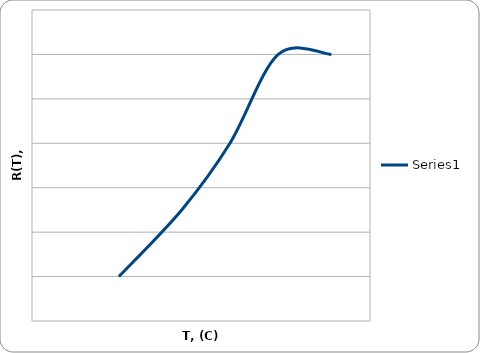
| Category | Series 0 |
|---|---|
| 18.0 | 46.5 |
| 31.0 | 46.53 |
| 41.0 | 46.56 |
| 51.0 | 46.6 |
| 62.0 | 46.6 |